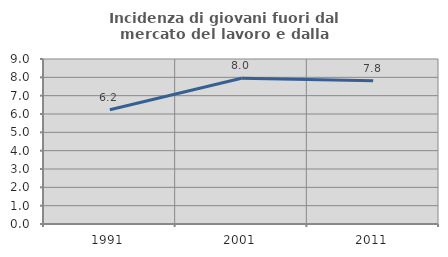
| Category | Incidenza di giovani fuori dal mercato del lavoro e dalla formazione  |
|---|---|
| 1991.0 | 6.233 |
| 2001.0 | 7.951 |
| 2011.0 | 7.814 |